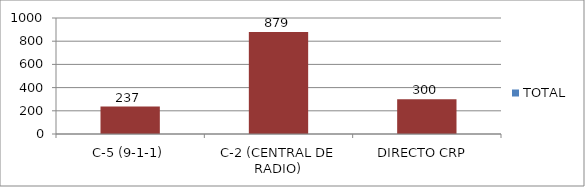
| Category | TOTAL |
|---|---|
| C-5 (9-1-1) | 237 |
| C-2 (CENTRAL DE RADIO) | 879 |
| DIRECTO CRP  | 300 |